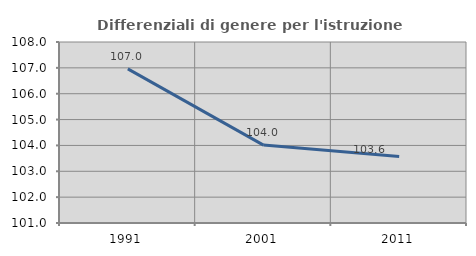
| Category | Differenziali di genere per l'istruzione superiore |
|---|---|
| 1991.0 | 106.959 |
| 2001.0 | 104.012 |
| 2011.0 | 103.569 |